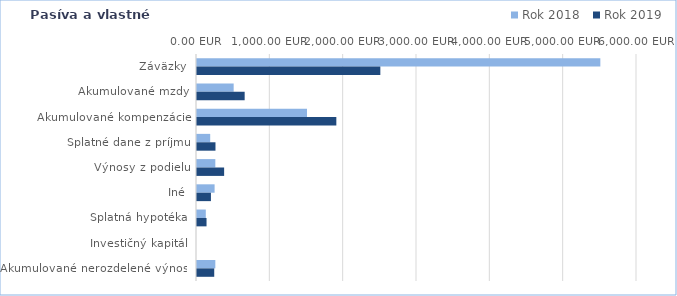
| Category | Rok 2018 | Rok 2019 |
|---|---|---|
| Záväzky | 5500 | 2500 |
| Akumulované mzdy | 500 | 650 |
| Akumulované kompenzácie | 1500 | 1900 |
| Splatné dane z príjmu | 180 | 252 |
| Výnosy z podielu | 250 | 370 |
| Iné | 240 | 190 |
| Splatná hypotéka | 120 | 130 |
| Investičný kapitál | 0 | 0 |
| Akumulované nerozdelené výnosy | 250 | 235 |